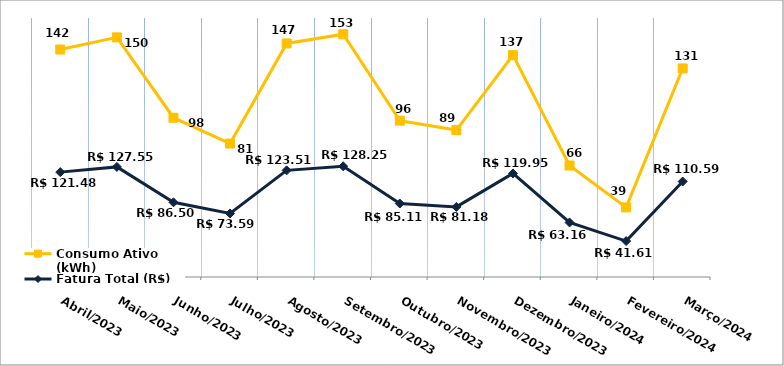
| Category | Fatura Total (R$) | Consumo Ativo (kWh) |
|---|---|---|
| Abril/2023 | 121.48 | 142 |
| Maio/2023 | 127.55 | 150 |
| Junho/2023 | 86.5 | 98 |
| Julho/2023 | 73.59 | 81 |
| Agosto/2023 | 123.51 | 147 |
| Setembro/2023 | 128.25 | 153 |
| Outubro/2023 | 85.11 | 96 |
| Novembro/2023 | 81.18 | 89 |
| Dezembro/2023 | 119.95 | 137 |
| Janeiro/2024 | 63.16 | 66 |
| Fevereiro/2024 | 41.61 | 39 |
| Março/2024 | 110.59 | 131 |